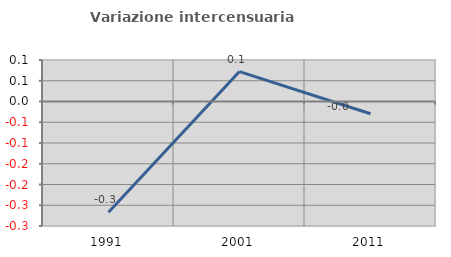
| Category | Variazione intercensuaria annua |
|---|---|
| 1991.0 | -0.267 |
| 2001.0 | 0.072 |
| 2011.0 | -0.029 |